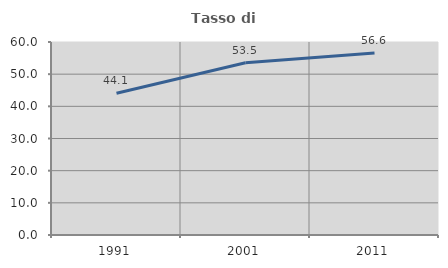
| Category | Tasso di occupazione   |
|---|---|
| 1991.0 | 44.068 |
| 2001.0 | 53.545 |
| 2011.0 | 56.566 |